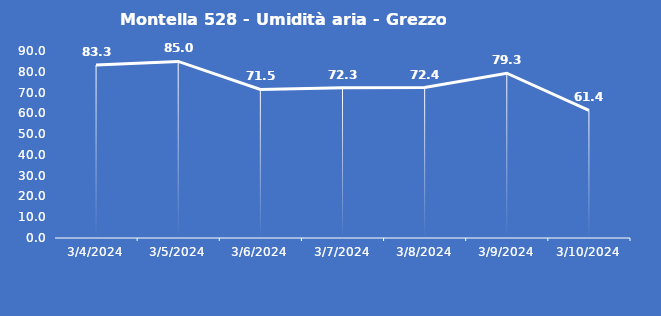
| Category | Montella 528 - Umidità aria - Grezzo (%) |
|---|---|
| 3/4/24 | 83.3 |
| 3/5/24 | 85 |
| 3/6/24 | 71.5 |
| 3/7/24 | 72.3 |
| 3/8/24 | 72.4 |
| 3/9/24 | 79.3 |
| 3/10/24 | 61.4 |